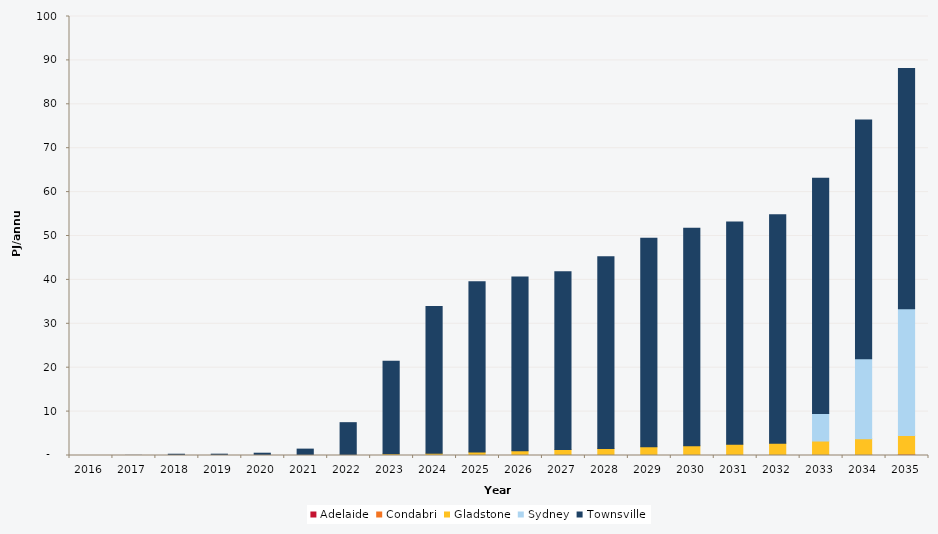
| Category | Adelaide | Condabri | Gladstone | Sydney | Townsville |
|---|---|---|---|---|---|
| 2016.0 | 0 | 0 | 0 | 0 | 0 |
| 2017.0 | 0 | 0 | 0 | 0 | 0.033 |
| 2018.0 | 0 | 0 | 0 | 0 | 0.29 |
| 2019.0 | 0 | 0 | 0 | 0 | 0.301 |
| 2020.0 | 0 | 0 | 0 | 0 | 0.523 |
| 2021.0 | 0 | 0 | 0.001 | 0 | 1.453 |
| 2022.0 | 0 | 0 | 0.129 | 0 | 7.349 |
| 2023.0 | 0 | 0 | 0.384 | 0 | 21.083 |
| 2024.0 | 0 | 0 | 0.524 | 0 | 33.396 |
| 2025.0 | 0 | 0 | 0.815 | 0 | 38.763 |
| 2026.0 | 0 | 0 | 1.092 | 0 | 39.587 |
| 2027.0 | 0 | 0 | 1.374 | 0 | 40.461 |
| 2028.0 | 0 | 0 | 1.599 | 0 | 43.692 |
| 2029.0 | 0 | 0 | 1.985 | 0 | 47.503 |
| 2030.0 | 0 | 0 | 2.223 | 0 | 49.55 |
| 2031.0 | 0.029 | 0 | 2.557 | 0 | 50.582 |
| 2032.0 | 0.033 | 0 | 2.768 | 0 | 52.035 |
| 2033.0 | 0.048 | 0 | 3.247 | 6.26 | 53.576 |
| 2034.0 | 0.119 | 0 | 3.689 | 18.207 | 54.384 |
| 2035.0 | 0.291 | 0.028 | 4.213 | 28.893 | 54.715 |